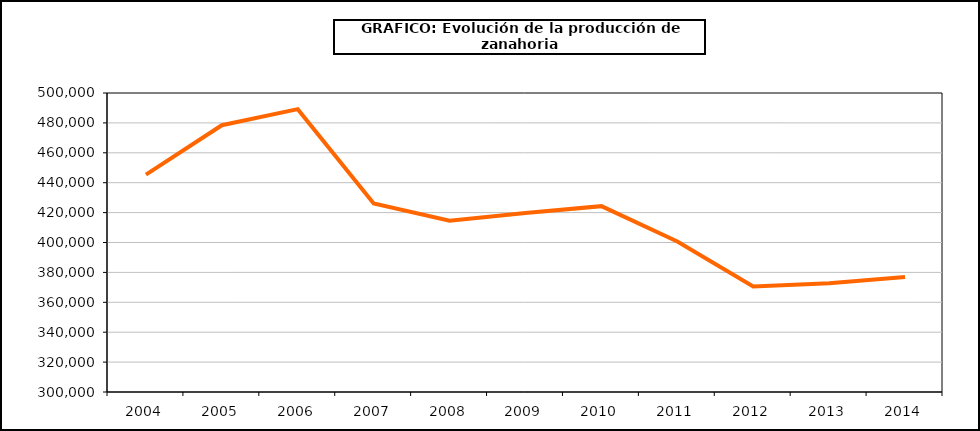
| Category | producción |
|---|---|
| 2004.0 | 445445 |
| 2005.0 | 478428 |
| 2006.0 | 489189 |
| 2007.0 | 426074 |
| 2008.0 | 414507 |
| 2009.0 | 419662 |
| 2010.0 | 424311 |
| 2011.0 | 400628 |
| 2012.0 | 370570 |
| 2013.0 | 372714 |
| 2014.0 | 376952 |